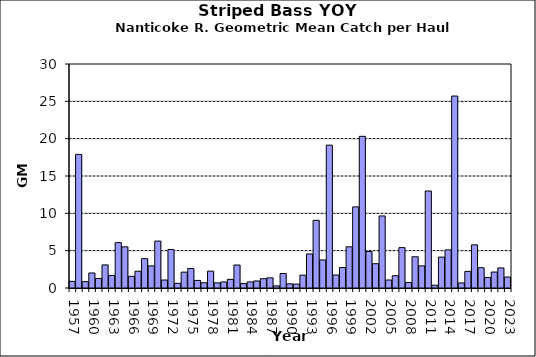
| Category | Series 0 |
|---|---|
| 1957.0 | 0.888 |
| 1958.0 | 17.893 |
| 1959.0 | 0.849 |
| 1960.0 | 2.013 |
| 1961.0 | 1.276 |
| 1962.0 | 3.089 |
| 1963.0 | 1.685 |
| 1964.0 | 6.076 |
| 1965.0 | 5.513 |
| 1966.0 | 1.567 |
| 1967.0 | 2.246 |
| 1968.0 | 3.934 |
| 1969.0 | 2.961 |
| 1970.0 | 6.286 |
| 1971.0 | 1.068 |
| 1972.0 | 5.158 |
| 1973.0 | 0.628 |
| 1974.0 | 2.123 |
| 1975.0 | 2.616 |
| 1976.0 | 1.015 |
| 1977.0 | 0.707 |
| 1978.0 | 2.259 |
| 1979.0 | 0.691 |
| 1980.0 | 0.807 |
| 1981.0 | 1.155 |
| 1982.0 | 3.078 |
| 1983.0 | 0.591 |
| 1984.0 | 0.81 |
| 1985.0 | 0.942 |
| 1986.0 | 1.244 |
| 1987.0 | 1.362 |
| 1988.0 | 0.281 |
| 1989.0 | 1.944 |
| 1990.0 | 0.56 |
| 1991.0 | 0.521 |
| 1992.0 | 1.723 |
| 1993.0 | 4.563 |
| 1994.0 | 9.062 |
| 1995.0 | 3.76 |
| 1996.0 | 19.132 |
| 1997.0 | 1.74 |
| 1998.0 | 2.738 |
| 1999.0 | 5.516 |
| 2000.0 | 10.865 |
| 2001.0 | 20.312 |
| 2002.0 | 4.887 |
| 2003.0 | 3.252 |
| 2004.0 | 9.65 |
| 2005.0 | 1.073 |
| 2006.0 | 1.646 |
| 2007.0 | 5.408 |
| 2008.0 | 0.727 |
| 2009.0 | 4.183 |
| 2010.0 | 2.96 |
| 2011.0 | 12.993 |
| 2012.0 | 0.371 |
| 2013.0 | 4.138 |
| 2014.0 | 5.101 |
| 2015.0 | 25.71 |
| 2016.0 | 0.678 |
| 2017.0 | 2.226 |
| 2018.0 | 5.779 |
| 2019.0 | 2.717 |
| 2020.0 | 1.41 |
| 2021.0 | 2.138 |
| 2022.0 | 2.684 |
| 2023.0 | 1.473 |